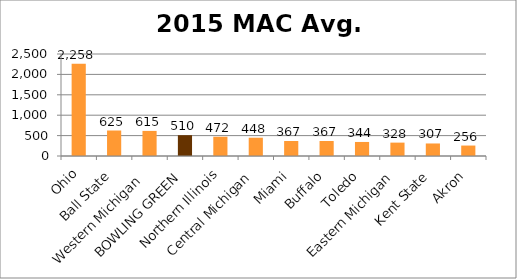
| Category | Series 0 |
|---|---|
| Ohio | 2258 |
| Ball State | 625 |
| Western Michigan  | 615 |
| BOWLING GREEN | 510 |
| Northern Illinois | 472 |
| Central Michigan | 448 |
| Miami | 367 |
| Buffalo | 367 |
| Toledo | 344 |
| Eastern Michigan | 328 |
| Kent State | 307 |
| Akron | 256 |